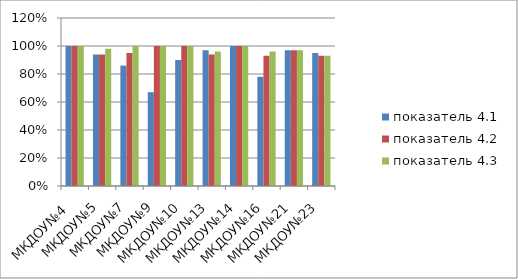
| Category | показатель 4.1 | показатель 4.2 | показатель 4.3 |
|---|---|---|---|
| МКДОУ№4  | 1 | 1 | 1 |
| МКДОУ№5 | 0.94 | 0.94 | 0.98 |
| МКДОУ№7 | 0.86 | 0.95 | 1 |
| МКДОУ№9 | 0.67 | 1 | 1 |
| МКДОУ№10 | 0.9 | 1 | 1 |
| МКДОУ№13 | 0.97 | 0.94 | 0.96 |
| МКДОУ№14 | 1 | 1 | 1 |
| МКДОУ№16 | 0.78 | 0.93 | 0.96 |
| МКДОУ№21 | 0.97 | 0.97 | 0.97 |
| МКДОУ№23 | 0.95 | 0.93 | 0.93 |